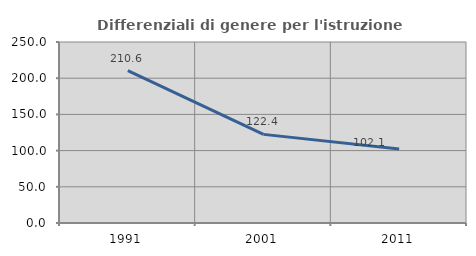
| Category | Differenziali di genere per l'istruzione superiore |
|---|---|
| 1991.0 | 210.598 |
| 2001.0 | 122.416 |
| 2011.0 | 102.057 |